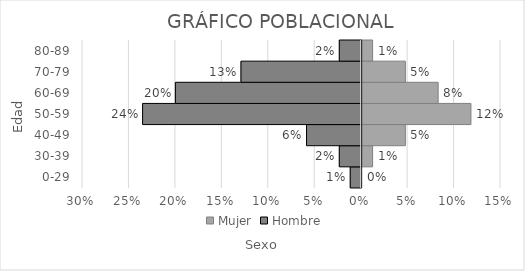
| Category | Mujer | Hombre |
|---|---|---|
| 0-29 | 0 | -0.012 |
| 30-39 | 0.012 | -0.024 |
| 40-49 | 0.047 | -0.059 |
| 50-59 | 0.118 | -0.235 |
| 60-69 | 0.082 | -0.2 |
| 70-79 | 0.047 | -0.129 |
| 80-89 | 0.012 | -0.024 |